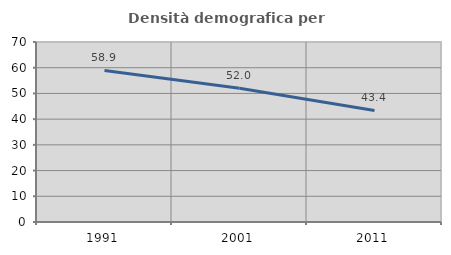
| Category | Densità demografica |
|---|---|
| 1991.0 | 58.949 |
| 2001.0 | 52.002 |
| 2011.0 | 43.368 |